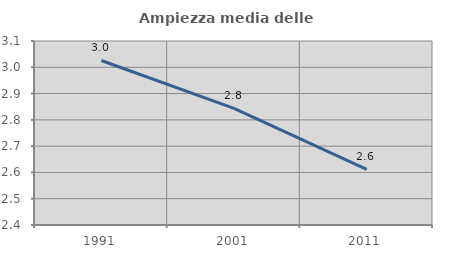
| Category | Ampiezza media delle famiglie |
|---|---|
| 1991.0 | 3.026 |
| 2001.0 | 2.844 |
| 2011.0 | 2.612 |